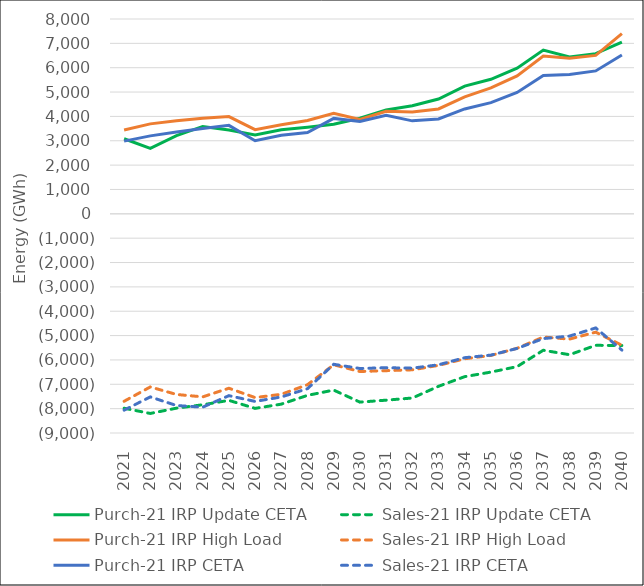
| Category | Purch-21 IRP Update CETA | Sales-21 IRP Update CETA | Purch-21 IRP High Load | Sales-21 IRP High Load | Purch-21 IRP CETA | Sales-21 IRP CETA |
|---|---|---|---|---|---|---|
| 2021.0 | 3083.328 | -7982.015 | 3442.34 | -7697.56 | 2986.24 | -8061.41 |
| 2022.0 | 2690.64 | -8197.246 | 3693.7 | -7108.53 | 3201.24 | -7518.1 |
| 2023.0 | 3212.992 | -7979.092 | 3825.01 | -7417.85 | 3361.33 | -7872.05 |
| 2024.0 | 3588.095 | -7841.046 | 3922.13 | -7516.11 | 3500.57 | -7939.83 |
| 2025.0 | 3444.895 | -7660.095 | 3994.79 | -7161.69 | 3633.53 | -7466.59 |
| 2026.0 | 3236.476 | -7989.066 | 3454.61 | -7545.65 | 3001.7 | -7703.47 |
| 2027.0 | 3448.859 | -7814.876 | 3660.66 | -7410.05 | 3223.85 | -7520.91 |
| 2028.0 | 3551.768 | -7453.487 | 3832.24 | -7015.63 | 3335.5 | -7179.27 |
| 2029.0 | 3675.265 | -7237.946 | 4124.31 | -6199.93 | 3918.69 | -6178.26 |
| 2030.0 | 3926.76 | -7732.141 | 3872.03 | -6475.51 | 3795.09 | -6351.6 |
| 2031.0 | 4266.381 | -7651.844 | 4207.96 | -6440.62 | 4049.96 | -6318.93 |
| 2032.0 | 4440.504 | -7563.336 | 4183.84 | -6405.69 | 3818.09 | -6337.32 |
| 2033.0 | 4715.603 | -7082.511 | 4305.84 | -6223.98 | 3895.64 | -6199.64 |
| 2034.0 | 5244.919 | -6686.282 | 4804.92 | -5951.32 | 4305.95 | -5907.18 |
| 2035.0 | 5524.79 | -6498.491 | 5171.13 | -5815.78 | 4565.24 | -5801.63 |
| 2036.0 | 5981.542 | -6274.109 | 5662.99 | -5521.17 | 4983.61 | -5526.77 |
| 2037.0 | 6721.502 | -5601.822 | 6481.91 | -5059.61 | 5682.68 | -5123.05 |
| 2038.0 | 6440.328 | -5785.283 | 6390.51 | -5144.77 | 5720.49 | -5020.56 |
| 2039.0 | 6578.152 | -5400.675 | 6504.74 | -4860.14 | 5868.09 | -4685.64 |
| 2040.0 | 7054.364 | -5406.574 | 7397.97 | -5394.57 | 6520.89 | -5595.97 |